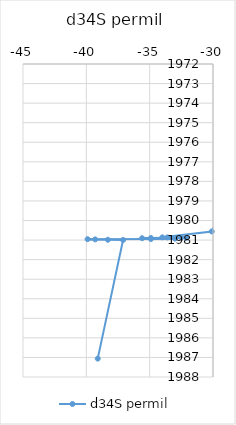
| Category | d34S permil |
|---|---|
| -27.8 | 1977.21 |
| -30.1 | 1980.56 |
| -34.0 | 1980.86 |
| -33.6 | 1980.865 |
| -32.5 | 1980.875 |
| -32.1 | 1980.885 |
| -34.9 | 1980.895 |
| -35.6 | 1980.905 |
| -33.0 | 1980.925 |
| -34.9 | 1980.945 |
| -39.9 | 1980.955 |
| -39.3 | 1980.965 |
| -38.3 | 1980.985 |
| -37.1 | 1980.995 |
| -39.1 | 1987.06 |